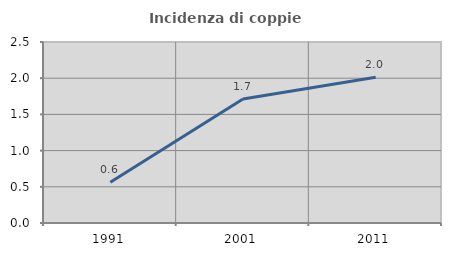
| Category | Incidenza di coppie miste |
|---|---|
| 1991.0 | 0.563 |
| 2001.0 | 1.714 |
| 2011.0 | 2.012 |